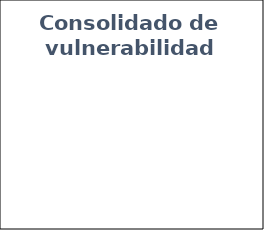
| Category | Series 0 |
|---|---|
| Críticas | 0 |
| Altas | 0 |
| Medias | 0 |
| Bajas | 0 |